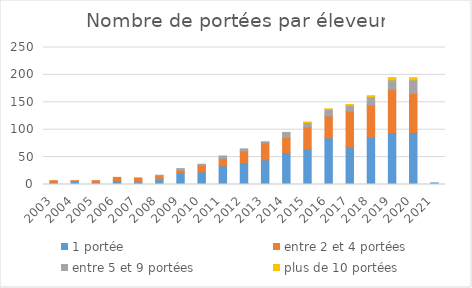
| Category | 1 portée | entre 2 et 4 portées | entre 5 et 9 portées | plus de 10 portées |
|---|---|---|---|---|
| 2003.0 | 4 | 3 | 0 | 0 |
| 2004.0 | 6 | 1 | 0 | 0 |
| 2005.0 | 4 | 3 | 0 | 0 |
| 2006.0 | 7 | 6 | 0 | 0 |
| 2007.0 | 5 | 7 | 0 | 0 |
| 2008.0 | 9 | 7 | 1 | 0 |
| 2009.0 | 21 | 5 | 3 | 0 |
| 2010.0 | 23 | 12 | 2 | 0 |
| 2011.0 | 34 | 13 | 5 | 0 |
| 2012.0 | 40 | 21 | 4 | 0 |
| 2013.0 | 45 | 31 | 2 | 0 |
| 2014.0 | 58 | 28 | 9 | 0 |
| 2015.0 | 65 | 40 | 8 | 1 |
| 2016.0 | 85 | 40 | 12 | 1 |
| 2017.0 | 69 | 65 | 10 | 2 |
| 2018.0 | 86 | 59 | 15 | 2 |
| 2019.0 | 94 | 79 | 18 | 4 |
| 2020.0 | 95 | 71 | 25 | 4 |
| 2021.0 | 3 | 0 | 0 | 0 |